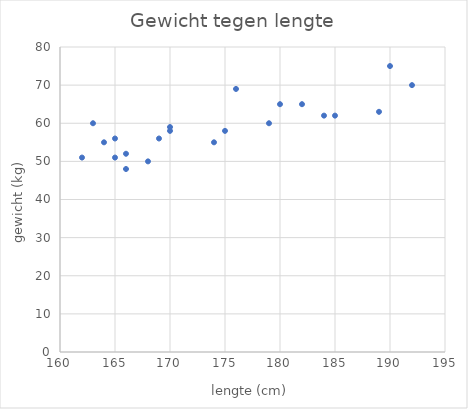
| Category | Series 0 |
|---|---|
| 192.0 | 70 |
| 174.0 | 55 |
| 166.0 | 52 |
| 163.0 | 60 |
| 165.0 | 56 |
| 170.0 | 58 |
| 165.0 | 51 |
| 189.0 | 63 |
| 168.0 | 50 |
| 185.0 | 62 |
| 190.0 | 75 |
| 169.0 | 56 |
| 176.0 | 69 |
| 180.0 | 65 |
| 166.0 | 48 |
| 170.0 | 59 |
| 179.0 | 60 |
| 175.0 | 58 |
| 162.0 | 51 |
| 164.0 | 55 |
| 182.0 | 65 |
| 184.0 | 62 |